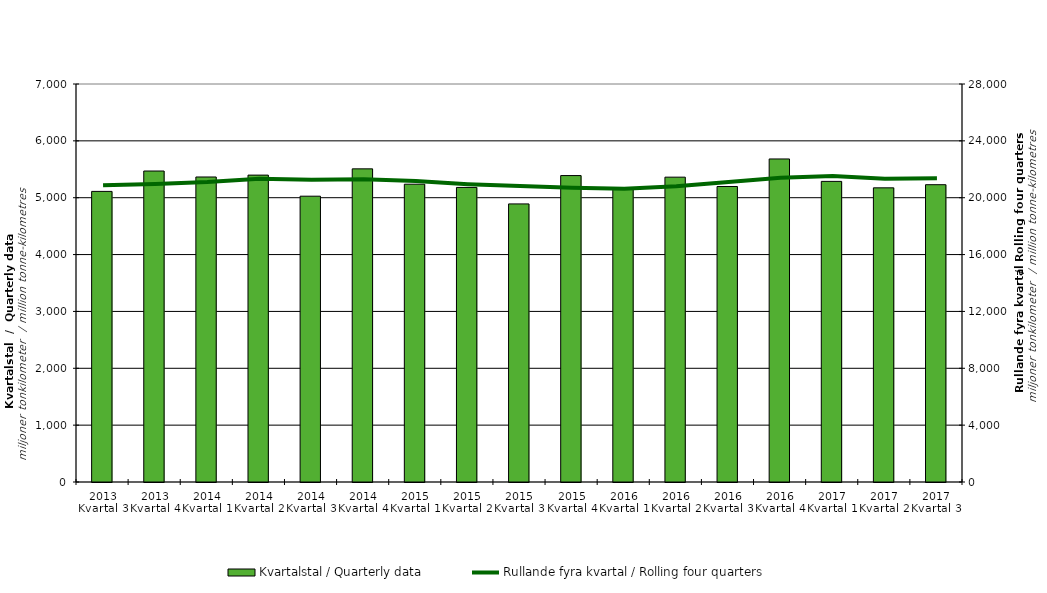
| Category | Kvartalstal / Quarterly data |
|---|---|
| 2013 Kvartal 3 | 5111.013 |
| 2013 Kvartal 4 | 5469.542 |
| 2014 Kvartal 1 | 5364.578 |
| 2014 Kvartal 2 | 5397.475 |
| 2014 Kvartal 3 | 5026.729 |
| 2014 Kvartal 4 | 5507.547 |
| 2015 Kvartal 1 | 5237.851 |
| 2015 Kvartal 2 | 5180.999 |
| 2015 Kvartal 3 | 4890.93 |
| 2015 Kvartal 4 | 5389.537 |
| 2016 Kvartal 1 | 5165.494 |
| 2016 Kvartal 2 | 5361.561 |
| 2016 Kvartal 3 | 5197.015 |
| 2016 Kvartal 4 | 5681.686 |
| 2017 Kvartal 1 | 5287.16 |
| 2017 Kvartal 2 | 5173.755 |
| 2017 Kvartal 3 | 5228.912 |